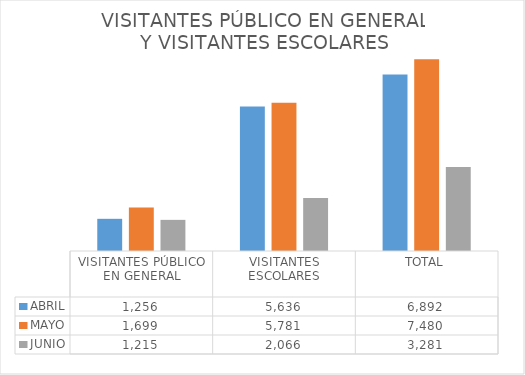
| Category | ABRIL | MAYO  | JUNIO |
|---|---|---|---|
| VISITANTES PÚBLICO EN GENERAL | 1256 | 1699 | 1215 |
| VISITANTES ESCOLARES | 5636 | 5781 | 2066 |
| TOTAL | 6892 | 7480 | 3281 |